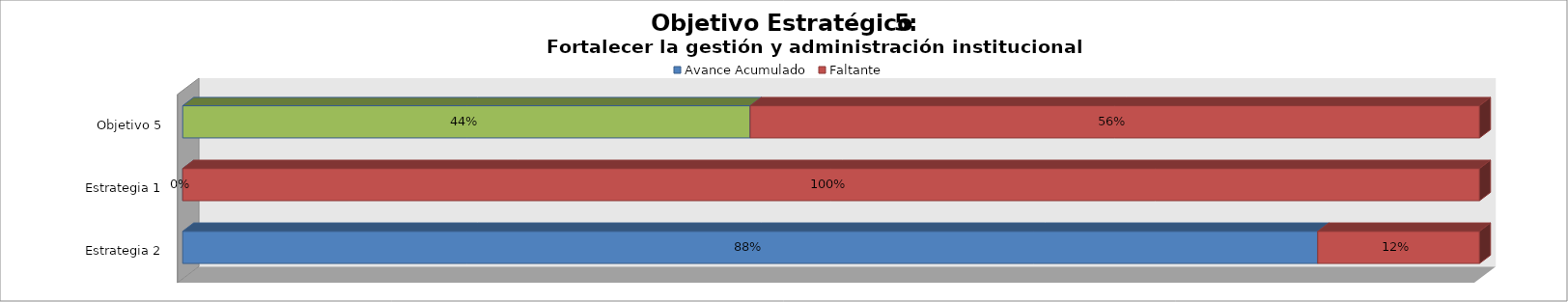
| Category | Avance Acumulado | Faltante |
|---|---|---|
| Estrategia 2 | 0.875 | 0.125 |
| Estrategia 1 | 0 | 1 |
| Objetivo 5 | 0.438 | 0.562 |